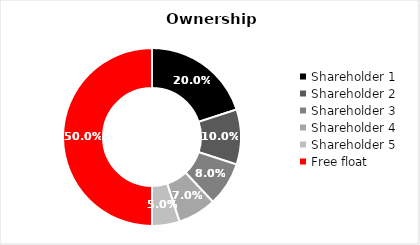
| Category | Series 0 |
|---|---|
| Shareholder 1 | 0.2 |
| Shareholder 2 | 0.1 |
| Shareholder 3 | 0.08 |
| Shareholder 4 | 0.07 |
| Shareholder 5 | 0.05 |
| Free float | 0.5 |